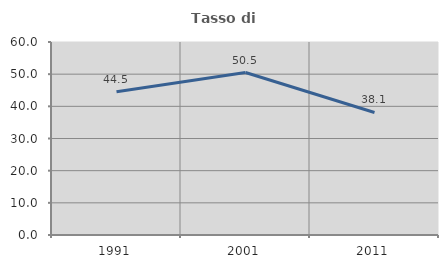
| Category | Tasso di occupazione   |
|---|---|
| 1991.0 | 44.531 |
| 2001.0 | 50.515 |
| 2011.0 | 38.095 |